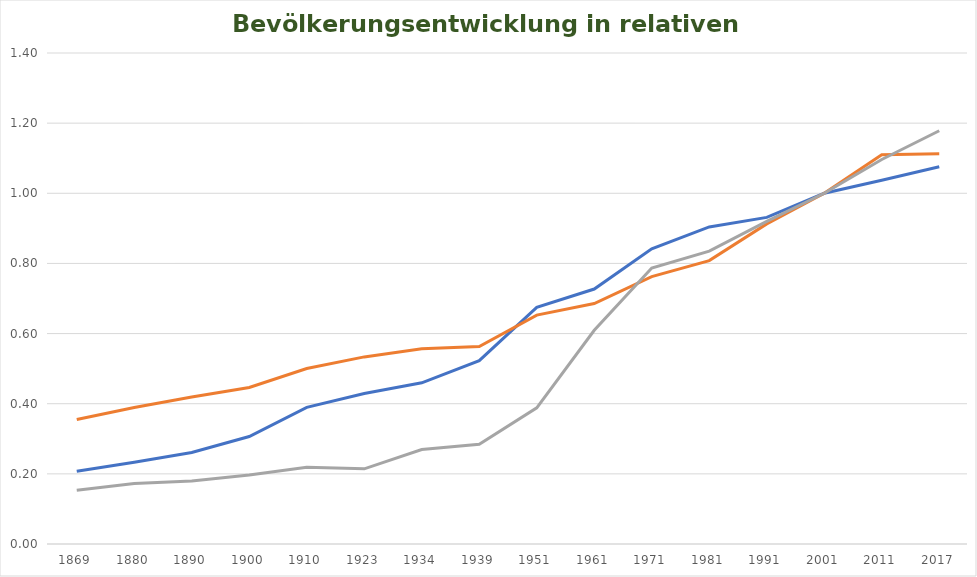
| Category | Relativ | Thalheim bei Wels | Marchtrenk |
|---|---|---|---|
| 1869.0 | 0.207 | 0.355 | 0.153 |
| 1880.0 | 0.233 | 0.389 | 0.172 |
| 1890.0 | 0.261 | 0.419 | 0.18 |
| 1900.0 | 0.306 | 0.446 | 0.197 |
| 1910.0 | 0.39 | 0.5 | 0.219 |
| 1923.0 | 0.429 | 0.533 | 0.214 |
| 1934.0 | 0.46 | 0.556 | 0.269 |
| 1939.0 | 0.523 | 0.563 | 0.284 |
| 1951.0 | 0.675 | 0.653 | 0.388 |
| 1961.0 | 0.727 | 0.686 | 0.609 |
| 1971.0 | 0.842 | 0.763 | 0.787 |
| 1981.0 | 0.904 | 0.808 | 0.835 |
| 1991.0 | 0.931 | 0.913 | 0.92 |
| 2001.0 | 1 | 1 | 1 |
| 2011.0 | 1.037 | 1.11 | 1.096 |
| 2017.0 | 1.075 | 1.113 | 1.178 |